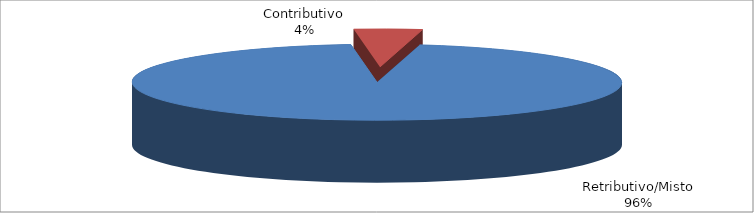
| Category | Series 1 |
|---|---|
| Retributivo/Misto | 20671 |
| Contributivo | 971 |